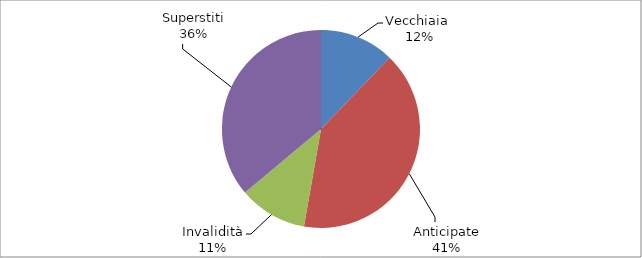
| Category | Series 0 |
|---|---|
| Vecchiaia  | 38102 |
| Anticipate | 126854 |
| Invalidità | 34922 |
| Superstiti | 112787 |